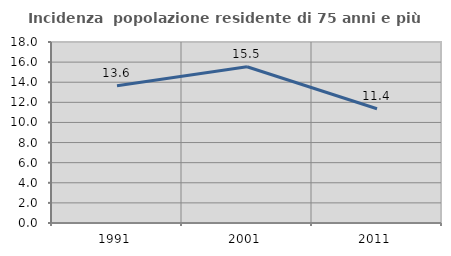
| Category | Incidenza  popolazione residente di 75 anni e più |
|---|---|
| 1991.0 | 13.647 |
| 2001.0 | 15.534 |
| 2011.0 | 11.359 |